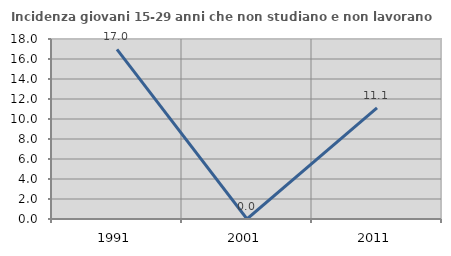
| Category | Incidenza giovani 15-29 anni che non studiano e non lavorano  |
|---|---|
| 1991.0 | 16.969 |
| 2001.0 | 0 |
| 2011.0 | 11.111 |